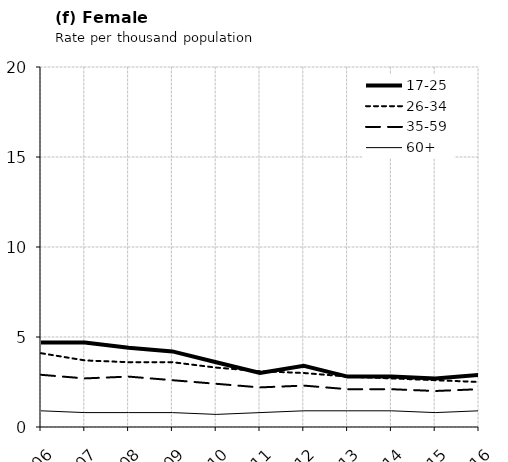
| Category | 17-25 | 26-34 | 35-59 | 60+ |
|---|---|---|---|---|
| 2006.0 | 4.7 | 4.1 | 2.9 | 0.9 |
| 2007.0 | 4.7 | 3.7 | 2.7 | 0.8 |
| 2008.0 | 4.4 | 3.6 | 2.8 | 0.8 |
| 2009.0 | 4.2 | 3.6 | 2.6 | 0.8 |
| 2010.0 | 3.6 | 3.3 | 2.4 | 0.7 |
| 2011.0 | 3 | 3.1 | 2.2 | 0.8 |
| 2012.0 | 3.4 | 3 | 2.3 | 0.9 |
| 2013.0 | 2.8 | 2.8 | 2.1 | 0.9 |
| 2014.0 | 2.8 | 2.7 | 2.1 | 0.9 |
| 2015.0 | 2.7 | 2.6 | 2 | 0.8 |
| 2016.0 | 2.9 | 2.5 | 2.1 | 0.9 |